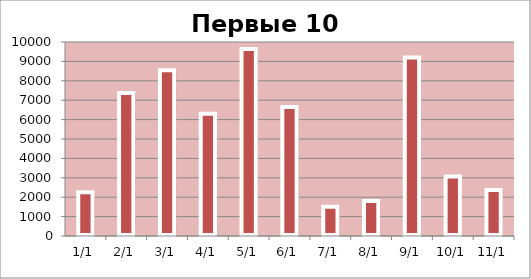
| Category | Сумма |
|---|---|
| 2010-01-01 | 2255 |
| 2010-01-02 | 7369 |
| 2010-01-03 | 8547 |
| 2010-01-04 | 6303 |
| 2010-01-05 | 9640 |
| 2010-01-06 | 6648 |
| 2010-01-07 | 1514 |
| 2010-01-08 | 1809 |
| 2010-01-09 | 9198 |
| 2010-01-10 | 3071 |